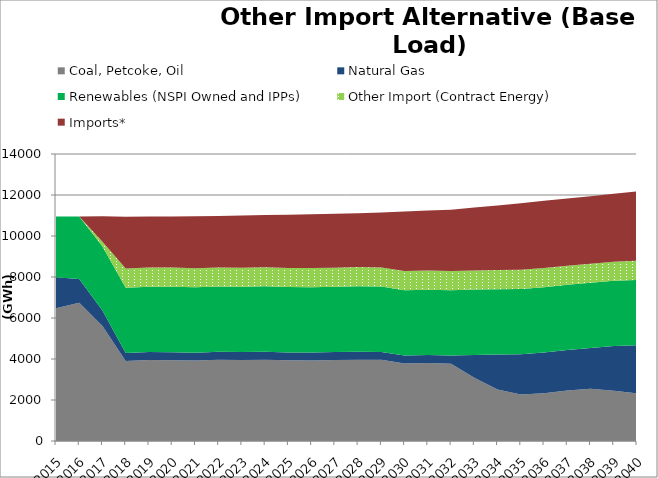
| Category | Coal, Petcoke, Oil | Natural Gas | Renewables (NSPI Owned and IPPs) | Other Import (Contract Energy) | Imports* |
|---|---|---|---|---|---|
| 2015.0 | 6470.622 | 1521.96 | 2959.036 | 0 | 0 |
| 2016.0 | 6748.166 | 1159.649 | 3041.158 | 0 | 0 |
| 2017.0 | 5609.378 | 761.494 | 3111.572 | 234.865 | 1241.233 |
| 2018.0 | 3900.676 | 393.11 | 3186.595 | 931.8 | 2532.159 |
| 2019.0 | 3946.623 | 394.48 | 3186.595 | 931.8 | 2494.283 |
| 2020.0 | 3939.975 | 394.001 | 3191.672 | 934.353 | 2489.729 |
| 2021.0 | 3921.297 | 386.859 | 3186.595 | 931.8 | 2531.169 |
| 2022.0 | 3962.008 | 386.51 | 3186.595 | 931.8 | 2505.168 |
| 2023.0 | 3952.166 | 385.253 | 3186.595 | 931.8 | 2546.276 |
| 2024.0 | 3965.387 | 389.247 | 3191.672 | 934.353 | 2541.011 |
| 2025.0 | 3934.813 | 386.521 | 3186.595 | 931.8 | 2599.472 |
| 2026.0 | 3930.43 | 385.949 | 3186.595 | 931.8 | 2629.088 |
| 2027.0 | 3951.842 | 384.528 | 3186.595 | 931.8 | 2635.794 |
| 2028.0 | 3967.694 | 388.543 | 3191.672 | 934.353 | 2632.1 |
| 2029.0 | 3958.607 | 388.791 | 3186.595 | 931.8 | 2684.47 |
| 2030.0 | 3783.345 | 386.913 | 3186.595 | 931.8 | 2904.657 |
| 2031.0 | 3803.171 | 389.462 | 3186.595 | 931.8 | 2927.502 |
| 2032.0 | 3772.112 | 394.004 | 3191.672 | 934.353 | 2988.808 |
| 2033.0 | 3079.996 | 1120.901 | 3186.595 | 931.8 | 3067.189 |
| 2034.0 | 2516.57 | 1700.746 | 3186.595 | 931.8 | 3158.169 |
| 2035.0 | 2272.922 | 1957.275 | 3186.595 | 931.8 | 3254.587 |
| 2036.0 | 2331.213 | 1980.884 | 3191.672 | 934.353 | 3276.279 |
| 2037.0 | 2463.507 | 1970.043 | 3186.595 | 931.8 | 3275.637 |
| 2038.0 | 2548.057 | 1983.174 | 3186.595 | 931.8 | 3291.368 |
| 2039.0 | 2451.825 | 2176.688 | 3186.595 | 931.8 | 3309.814 |
| 2040.0 | 2328.624 | 2340.767 | 3191.672 | 934.353 | 3378.975 |